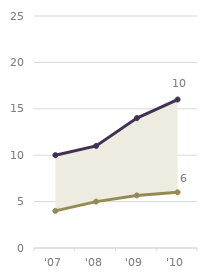
| Category | Bisc | choc-bisc |
|---|---|---|
| '07 | 4 | 6 |
| '08 | 5 | 6 |
| '09 | 5.667 | 8.333 |
| '10 | 6 | 10 |